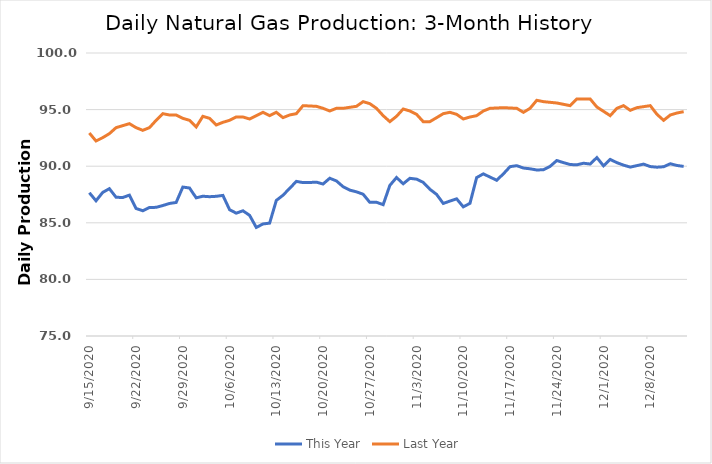
| Category | This Year | Last Year |
|---|---|---|
| 9/15/20 | 87.654 | 92.933 |
| 9/16/20 | 86.945 | 92.226 |
| 9/17/20 | 87.684 | 92.521 |
| 9/18/20 | 88.014 | 92.874 |
| 9/19/20 | 87.256 | 93.405 |
| 9/20/20 | 87.233 | 93.581 |
| 9/21/20 | 87.443 | 93.758 |
| 9/22/20 | 86.268 | 93.405 |
| 9/23/20 | 86.064 | 93.169 |
| 9/24/20 | 86.352 | 93.405 |
| 9/25/20 | 86.365 | 94.053 |
| 9/26/20 | 86.526 | 94.642 |
| 9/27/20 | 86.708 | 94.524 |
| 9/28/20 | 86.797 | 94.524 |
| 9/29/20 | 88.157 | 94.229 |
| 9/30/20 | 88.073 | 94.053 |
| 10/1/20 | 87.206 | 93.464 |
| 10/2/20 | 87.347 | 94.406 |
| 10/3/20 | 87.306 | 94.229 |
| 10/4/20 | 87.34 | 93.64 |
| 10/5/20 | 87.419 | 93.876 |
| 10/6/20 | 86.16 | 94.053 |
| 10/7/20 | 85.851 | 94.347 |
| 10/8/20 | 86.061 | 94.347 |
| 10/9/20 | 85.659 | 94.17 |
| 10/10/20 | 84.59 | 94.465 |
| 10/11/20 | 84.897 | 94.76 |
| 10/12/20 | 84.972 | 94.465 |
| 10/13/20 | 86.976 | 94.76 |
| 10/14/20 | 87.436 | 94.288 |
| 10/15/20 | 88.043 | 94.524 |
| 10/16/20 | 88.659 | 94.642 |
| 10/17/20 | 88.552 | 95.349 |
| 10/18/20 | 88.56 | 95.319 |
| 10/19/20 | 88.591 | 95.29 |
| 10/20/20 | 88.426 | 95.113 |
| 10/21/20 | 88.937 | 94.877 |
| 10/22/20 | 88.7 | 95.113 |
| 10/23/20 | 88.189 | 95.113 |
| 10/24/20 | 87.887 | 95.201 |
| 10/25/20 | 87.736 | 95.29 |
| 10/26/20 | 87.524 | 95.702 |
| 10/27/20 | 86.805 | 95.525 |
| 10/28/20 | 86.813 | 95.113 |
| 10/29/20 | 86.603 | 94.465 |
| 10/30/20 | 88.303 | 93.935 |
| 10/31/20 | 88.999 | 94.406 |
| 11/1/20 | 88.447 | 95.054 |
| 11/2/20 | 88.93 | 94.877 |
| 11/3/20 | 88.857 | 94.583 |
| 11/4/20 | 88.574 | 93.935 |
| 11/5/20 | 87.961 | 93.935 |
| 11/6/20 | 87.51 | 94.288 |
| 11/7/20 | 86.71 | 94.642 |
| 11/8/20 | 86.92 | 94.76 |
| 11/9/20 | 87.119 | 94.583 |
| 11/10/20 | 86.409 | 94.17 |
| 11/11/20 | 86.721 | 94.347 |
| 11/12/20 | 88.993 | 94.465 |
| 11/13/20 | 89.324 | 94.877 |
| 11/14/20 | 89.039 | 95.113 |
| 11/15/20 | 88.759 | 95.142 |
| 11/16/20 | 89.32 | 95.172 |
| 11/17/20 | 89.96 | 95.142 |
| 11/18/20 | 90.047 | 95.113 |
| 11/19/20 | 89.839 | 94.76 |
| 11/20/20 | 89.77 | 95.113 |
| 11/21/20 | 89.666 | 95.82 |
| 11/22/20 | 89.687 | 95.702 |
| 11/23/20 | 89.986 | 95.643 |
| 11/24/20 | 90.501 | 95.584 |
| 11/25/20 | 90.316 | 95.466 |
| 11/26/20 | 90.148 | 95.349 |
| 11/27/20 | 90.123 | 95.938 |
| 11/28/20 | 90.262 | 95.938 |
| 11/29/20 | 90.191 | 95.938 |
| 11/30/20 | 90.761 | 95.231 |
| 12/1/20 | 90.032 | 94.848 |
| 12/2/20 | 90.6 | 94.465 |
| 12/3/20 | 90.312 | 95.113 |
| 12/4/20 | 90.095 | 95.349 |
| 12/5/20 | 89.919 | 94.936 |
| 12/6/20 | 90.051 | 95.172 |
| 12/7/20 | 90.184 | 95.26 |
| 12/8/20 | 89.967 | 95.349 |
| 12/9/20 | 89.912 | 94.583 |
| 12/10/20 | 89.951 | 94.053 |
| 12/11/20 | 90.216 | 94.524 |
| 12/12/20 | 90.064 | 94.701 |
| 12/13/20 | 89.981 | 94.818 |